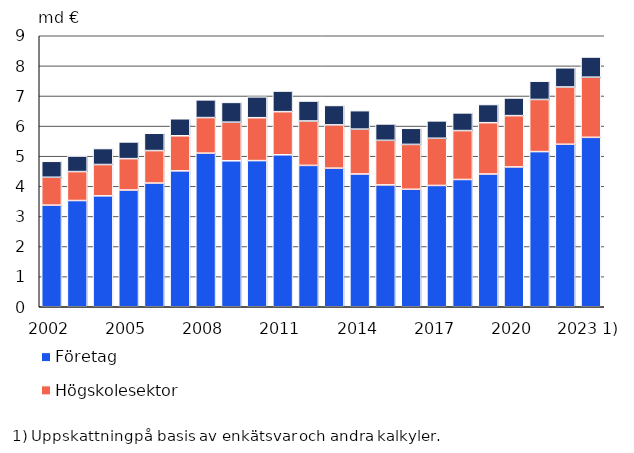
| Category | Företag | Högskolesektor | Offentlig sektor inkl. den privata icke-vinstsyftande sektorn |
|---|---|---|---|
| 2002 | 3375.1 | 925.6 | 529.7 |
| 2003 | 3527.9 | 961.7 | 515.4 |
| 2004 | 3683.5 | 1039.9 | 530.1 |
| 2005 | 3876.9 | 1042.2 | 554.7 |
| 2006 | 4107.8 | 1079.2 | 574.2 |
| 2007 | 4513.4 | 1164.6 | 564.7 |
| 2008 | 5102 | 1180.6 | 588.5 |
| 2009 | 4847.2 | 1282.8 | 656.5 |
| 2010 | 4854 | 1424.8 | 692 |
| 2011 | 5047 | 1431.8 | 684.4 |
| 2012 | 4695 | 1474.6 | 662.2 |
| 2013 | 4602.4 | 1438.1 | 643.6 |
| 2014 | 4409.5 | 1489.5 | 613.1 |
| 2015 | 4047.3 | 1480.5 | 543.1 |
| 2016 | 3901.7 | 1489.8 | 534.6 |
| 2017 | 4028.4 | 1567.2 | 577.7 |
| 2018 | 4227 | 1624 | 587 |
| 2019 | 4408 | 1705 | 603 |
| 2020 | 4644 | 1703 | 586 |
| 2021 | 5153 | 1731 | 607 |
| 2022 | 5397 | 1902 | 637 |
| 2023 1) | 5627 | 1997 | 670 |